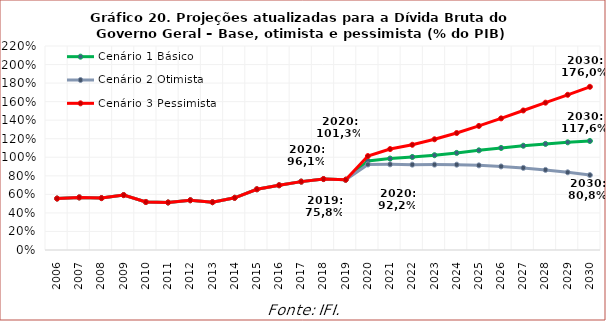
| Category | Cenário 1 Básico | Cenário 2 Otimista | Cenário 3 Pessimista |
|---|---|---|---|
| 2006.0 | 0.555 | 0.555 | 0.555 |
| 2007.0 | 0.567 | 0.567 | 0.567 |
| 2008.0 | 0.56 | 0.56 | 0.56 |
| 2009.0 | 0.592 | 0.592 | 0.592 |
| 2010.0 | 0.518 | 0.518 | 0.518 |
| 2011.0 | 0.513 | 0.513 | 0.513 |
| 2012.0 | 0.537 | 0.537 | 0.537 |
| 2013.0 | 0.515 | 0.515 | 0.515 |
| 2014.0 | 0.563 | 0.563 | 0.563 |
| 2015.0 | 0.655 | 0.655 | 0.655 |
| 2016.0 | 0.698 | 0.698 | 0.698 |
| 2017.0 | 0.737 | 0.737 | 0.737 |
| 2018.0 | 0.765 | 0.765 | 0.765 |
| 2019.0 | 0.758 | 0.758 | 0.758 |
| 2020.0 | 0.961 | 0.922 | 1.013 |
| 2021.0 | 0.986 | 0.924 | 1.088 |
| 2022.0 | 1.003 | 0.92 | 1.135 |
| 2023.0 | 1.022 | 0.921 | 1.194 |
| 2024.0 | 1.047 | 0.92 | 1.262 |
| 2025.0 | 1.075 | 0.913 | 1.338 |
| 2026.0 | 1.1 | 0.901 | 1.42 |
| 2027.0 | 1.124 | 0.886 | 1.505 |
| 2028.0 | 1.144 | 0.864 | 1.589 |
| 2029.0 | 1.161 | 0.838 | 1.674 |
| 2030.0 | 1.176 | 0.808 | 1.76 |